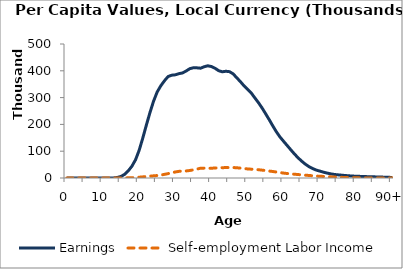
| Category | Earnings | Self-employment Labor Income |
|---|---|---|
| 0 | 0 | 0 |
|  | 0 | 0 |
| 2 | 0 | 0 |
| 3 | 0 | 0 |
| 4 | 0 | 0 |
| 5 | 0 | 0 |
| 6 | 0 | 0 |
| 7 | 0 | 0 |
| 8 | 0 | 0 |
| 9 | 0 | 0 |
| 10 | 0 | 0 |
| 11 | 3.733 | 0 |
| 12 | 98.209 | 0 |
| 13 | 468.043 | 10.193 |
| 14 | 2081.432 | 38.113 |
| 15 | 5889.901 | 171.617 |
| 16 | 13683.288 | 389.212 |
| 17 | 26767.567 | 730.229 |
| 18 | 43914.641 | 1172.478 |
| 19 | 67711.411 | 1707.762 |
| 20 | 102941.288 | 2880.369 |
| 21 | 148288.288 | 4148.496 |
| 22 | 197218.323 | 5389.872 |
| 23 | 244081.704 | 6930.973 |
| 24 | 286815.928 | 8090.397 |
| 25 | 321023.777 | 9162.273 |
| 26 | 344112.047 | 11030.316 |
| 27 | 362656.7 | 13486.7 |
| 28 | 378390.964 | 16301.852 |
| 29 | 383568.802 | 19581.243 |
| 30 | 384989.283 | 22532.603 |
| 31 | 389298.592 | 24692.351 |
| 32 | 392050.774 | 25913.691 |
| 33 | 399136.978 | 26336.297 |
| 34 | 407764.133 | 27953.304 |
| 35 | 411375.963 | 30399.308 |
| 36 | 411038.321 | 33326.631 |
| 37 | 409725.499 | 36500.968 |
| 38 | 415140.628 | 36760.66 |
| 39 | 418710.144 | 36128.365 |
| 40 | 415919.996 | 36487.647 |
| 41 | 409465.349 | 37288.721 |
| 42 | 400362.801 | 37908.493 |
| 43 | 396363.142 | 38543.606 |
| 44 | 398234.819 | 38857.437 |
| 45 | 396800.507 | 39055.39 |
| 46 | 388592.97 | 39052.472 |
| 47 | 374089.086 | 38188.465 |
| 48 | 359814.105 | 36965.159 |
| 49 | 344104.947 | 35419.474 |
| 50 | 330621.948 | 33880.591 |
| 51 | 317554.55 | 32916.506 |
| 52 | 299054.704 | 31970.286 |
| 53 | 281244.893 | 30874.018 |
| 54 | 261527.551 | 29364.058 |
| 55 | 239562.998 | 27638.034 |
| 56 | 217285.16 | 25938.188 |
| 57 | 193855.44 | 24195.93 |
| 58 | 171687.238 | 22248.307 |
| 59 | 152390.202 | 20212.03 |
| 60 | 136251.809 | 18254.707 |
| 61 | 120459.313 | 16657.548 |
| 62 | 104521.182 | 15310.102 |
| 63 | 89117.918 | 14067.249 |
| 64 | 74905.693 | 12868.441 |
| 65 | 62371.006 | 11674.926 |
| 66 | 51477.825 | 10543.2 |
| 67 | 42205.631 | 9430.699 |
| 68 | 35293.694 | 8352.561 |
| 69 | 29453.247 | 7338.954 |
| 70 | 25745.132 | 6542.154 |
| 71 | 21698.493 | 5847.117 |
| 72 | 18363.642 | 5144.488 |
| 73 | 15392.42 | 4316.966 |
| 74 | 13216.198 | 3597.258 |
| 75 | 11831.524 | 2983.013 |
| 76 | 10535.08 | 2420.458 |
| 77 | 9263.119 | 1902.922 |
| 78 | 8218.234 | 1463.64 |
| 79 | 7268.818 | 1084.901 |
| 80 | 6629.921 | 780.024 |
| 81 | 6110.87 | 583.064 |
| 82 | 5586.532 | 422.016 |
| 83 | 5095.03 | 255.508 |
| 84 | 4749.404 | 91.691 |
| 85 | 4317.06 | 0 |
| 86 | 3889.409 | 0 |
| 87 | 3455.22 | 0 |
| 88 | 3008.461 | 0 |
| 89 | 2546.548 | 0 |
| 90+ | 2075.253 | 0 |